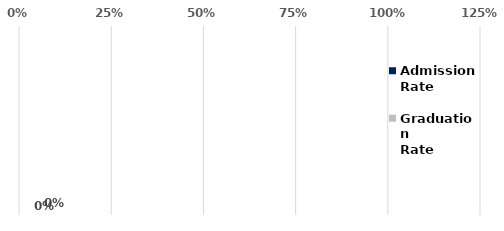
| Category | Admission
Rate | Graduation
Rate |
|---|---|---|
| Male | 0 | 0 |
| Female | 0 | 0 |
| Transgender Female | 0 | 0 |
| Transgender Male | 0 | 0 |
| Gender Fluid | 0 | 0 |
| Agender | 0 | 0 |
| Total | 0 | 0 |